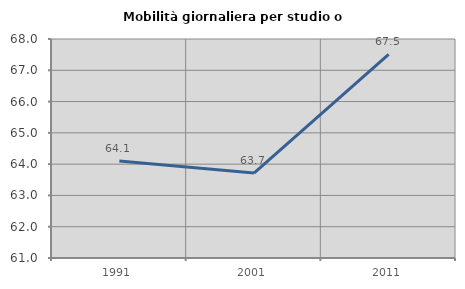
| Category | Mobilità giornaliera per studio o lavoro |
|---|---|
| 1991.0 | 64.103 |
| 2001.0 | 63.716 |
| 2011.0 | 67.513 |